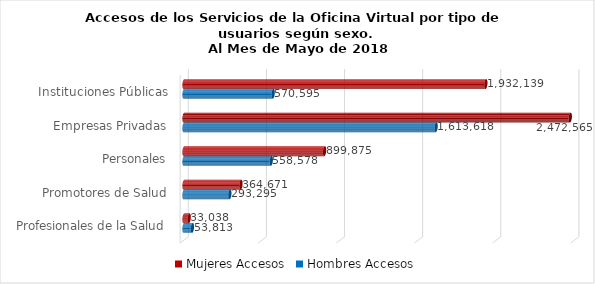
| Category | Mujeres | Hombres |
|---|---|---|
| Instituciones Públicas | 1932139 | 570595 |
| Empresas Privadas | 2472565 | 1613618 |
| Personales | 899875 | 558578 |
| Promotores de Salud | 364671 | 293295 |
| Profesionales de la Salud | 33038 | 53813 |